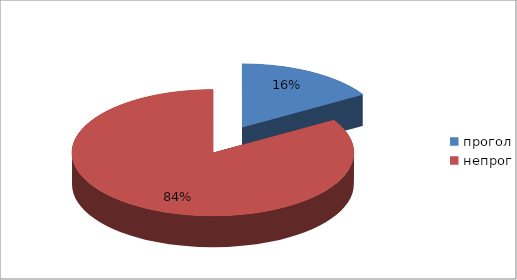
| Category | Series 0 |
|---|---|
| прогол | 16 |
| непрог | 82 |